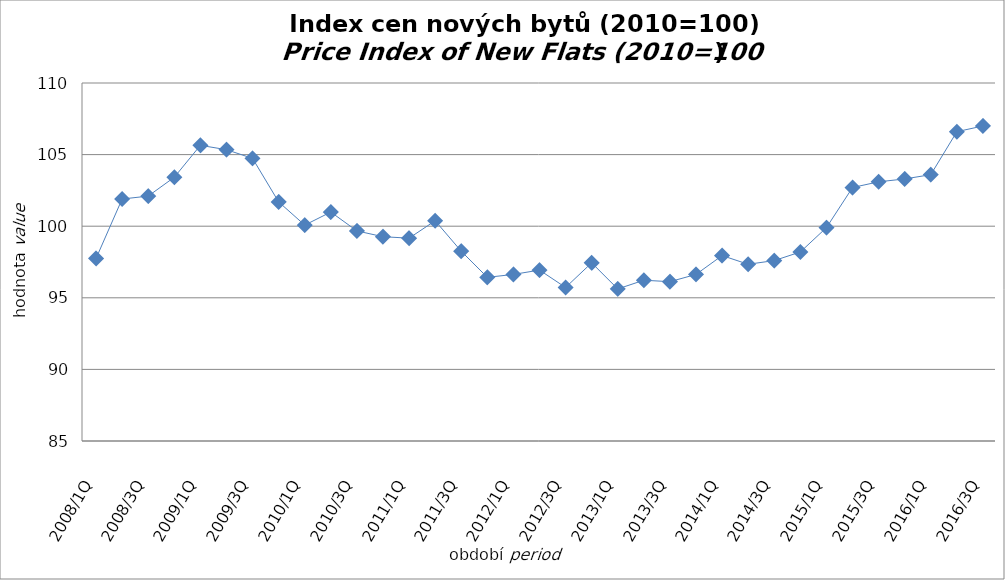
| Category | Series 0 |
|---|---|
| 2008/1Q | 97.746 |
| 2008/2Q | 101.899 |
| 2008/3Q | 102.102 |
| 2008/4Q | 103.419 |
| 2009/1Q | 105.647 |
| 2009/2Q | 105.343 |
| 2009/3Q | 104.735 |
| 2009/4Q | 101.697 |
| 2010/1Q | 100.076 |
| 2010/2Q | 100.988 |
| 2010/3Q | 99.671 |
| 2010/4Q | 99.266 |
| 2011/1Q | 99.164 |
| 2011/2Q | 100.38 |
| 2011/3Q | 98.253 |
| 2011/4Q | 96.429 |
| 2012/1Q | 96.632 |
| 2012/2Q | 96.936 |
| 2012/3Q | 95.72 |
| 2012/4Q | 97.442 |
| 2013/1Q | 95.619 |
| 2013/2Q | 96.227 |
| 2013/3Q | 96.126 |
| 2013/4Q | 96.632 |
| 2014/1Q | 97.949 |
| 2014/2Q | 97.341 |
| 2014/3Q | 97.6 |
| 2014/4Q | 98.2 |
| 2015/1Q | 99.9 |
| 2015/2Q | 102.7 |
| 2015/3Q | 103.1 |
| 2015/4Q | 103.3 |
| 2016/1Q | 103.6 |
| 2016/2Q | 106.6 |
| 2016/3Q | 107 |